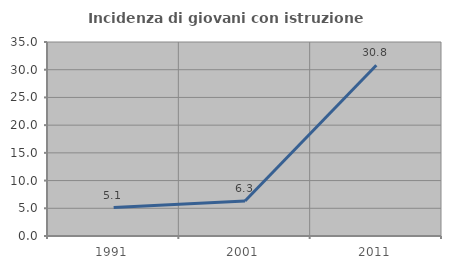
| Category | Incidenza di giovani con istruzione universitaria |
|---|---|
| 1991.0 | 5.128 |
| 2001.0 | 6.329 |
| 2011.0 | 30.818 |